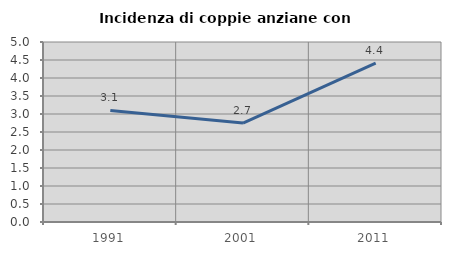
| Category | Incidenza di coppie anziane con figli |
|---|---|
| 1991.0 | 3.1 |
| 2001.0 | 2.749 |
| 2011.0 | 4.412 |